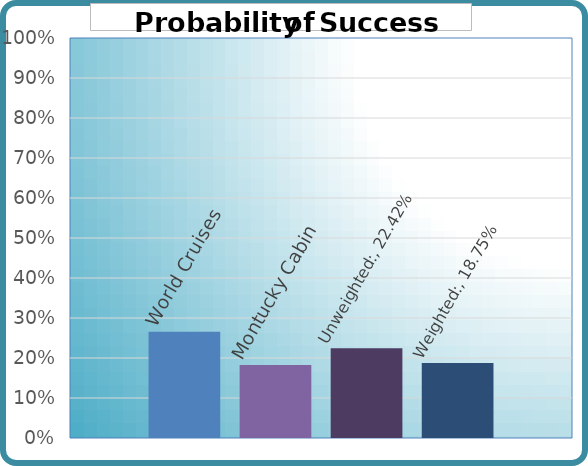
| Category | World Cruises |   | Montucky Cabin | Unweighted: | Weighted: |
|---|---|---|---|---|---|
| 0 | 0.266 |  | 0.183 | 0.224 | 0.188 |